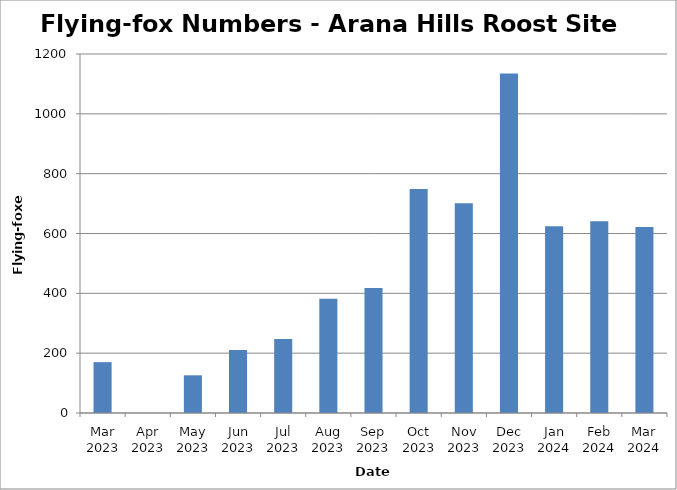
| Category | Flying-foxes |
|---|---|
| Mar 2023 | 170 |
| Apr 2023 | 0 |
| May 2023 | 126 |
| Jun 2023 | 211 |
| Jul 2023 | 247 |
| Aug 2023 | 382 |
| Sep 2023 | 418 |
| Oct 2023 | 749 |
| Nov 2023 | 701 |
| Dec 2023 | 1135 |
| Jan 2024 | 624 |
| Feb 2024 | 641 |
| Mar 2024 | 622 |